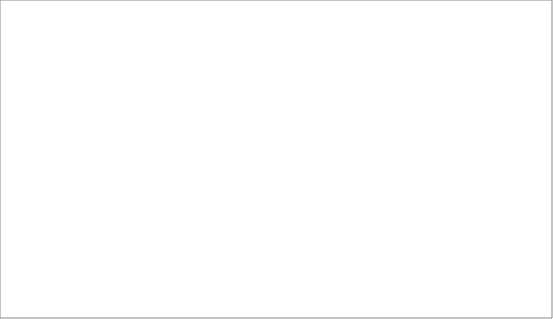
| Category | 2008 | 2009 | 2010 | 2011 | 2012 | 2013 |
|---|---|---|---|---|---|---|
| Afganistan | 1 | 7 | 3 | 2 | 2 | 3 |